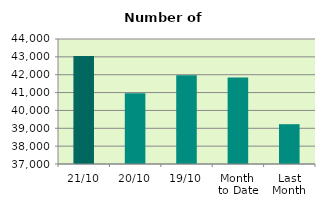
| Category | Series 0 |
|---|---|
| 21/10 | 43044 |
| 20/10 | 40958 |
| 19/10 | 41966 |
| Month 
to Date | 41850.133 |
| Last
Month | 39229.818 |